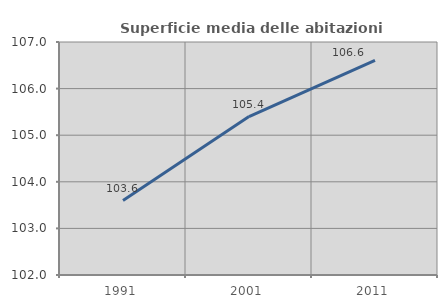
| Category | Superficie media delle abitazioni occupate |
|---|---|
| 1991.0 | 103.597 |
| 2001.0 | 105.4 |
| 2011.0 | 106.606 |